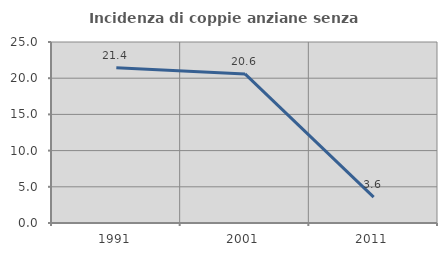
| Category | Incidenza di coppie anziane senza figli  |
|---|---|
| 1991.0 | 21.429 |
| 2001.0 | 20.588 |
| 2011.0 | 3.571 |